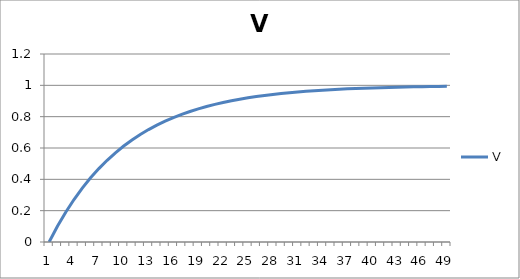
| Category | V |
|---|---|
| 0 | 0 |
| 1 | 0.1 |
| 2 | 0.19 |
| 3 | 0.271 |
| 4 | 0.344 |
| 5 | 0.41 |
| 6 | 0.469 |
| 7 | 0.522 |
| 8 | 0.57 |
| 9 | 0.613 |
| 10 | 0.651 |
| 11 | 0.686 |
| 12 | 0.718 |
| 13 | 0.746 |
| 14 | 0.771 |
| 15 | 0.794 |
| 16 | 0.815 |
| 17 | 0.833 |
| 18 | 0.85 |
| 19 | 0.865 |
| 20 | 0.878 |
| 21 | 0.891 |
| 22 | 0.902 |
| 23 | 0.911 |
| 24 | 0.92 |
| 25 | 0.928 |
| 26 | 0.935 |
| 27 | 0.942 |
| 28 | 0.948 |
| 29 | 0.953 |
| 30 | 0.958 |
| 31 | 0.962 |
| 32 | 0.966 |
| 33 | 0.969 |
| 34 | 0.972 |
| 35 | 0.975 |
| 36 | 0.977 |
| 37 | 0.98 |
| 38 | 0.982 |
| 39 | 0.984 |
| 40 | 0.985 |
| 41 | 0.987 |
| 42 | 0.988 |
| 43 | 0.989 |
| 44 | 0.99 |
| 45 | 0.991 |
| 46 | 0.992 |
| 47 | 0.993 |
| 48 | 0.994 |